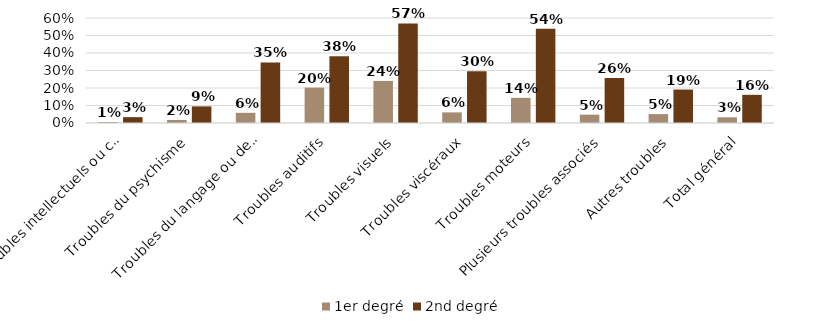
| Category | 1er degré | 2nd degré |
|---|---|---|
| Troubles intellectuels ou cognitifs | 0.006 | 0.033 |
| Troubles du psychisme | 0.017 | 0.095 |
| Troubles du langage ou de la parole | 0.058 | 0.346 |
| Troubles auditifs | 0.202 | 0.382 |
| Troubles visuels | 0.241 | 0.569 |
| Troubles viscéraux | 0.061 | 0.296 |
| Troubles moteurs | 0.144 | 0.538 |
| Plusieurs troubles associés | 0.048 | 0.258 |
| Autres troubles | 0.051 | 0.191 |
| Total général | 0.032 | 0.161 |